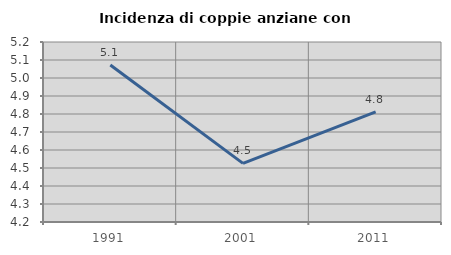
| Category | Incidenza di coppie anziane con figli |
|---|---|
| 1991.0 | 5.072 |
| 2001.0 | 4.526 |
| 2011.0 | 4.812 |